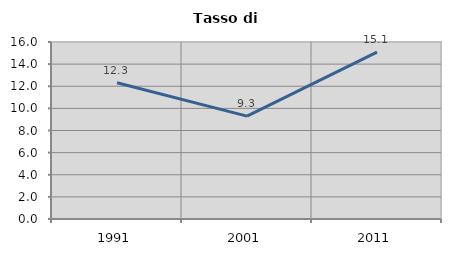
| Category | Tasso di disoccupazione   |
|---|---|
| 1991.0 | 12.319 |
| 2001.0 | 9.302 |
| 2011.0 | 15.079 |